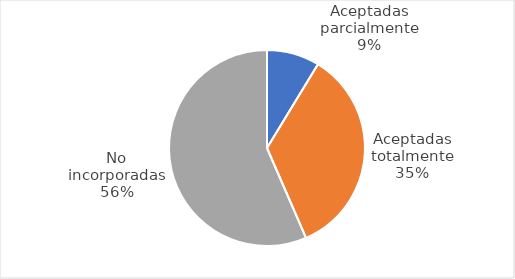
| Category | Total | % |
|---|---|---|
| Aceptadas parcialmente | 6 | 0.087 |
| Aceptadas totalmente | 24 | 0.348 |
| No incorporadas | 39 | 0.565 |